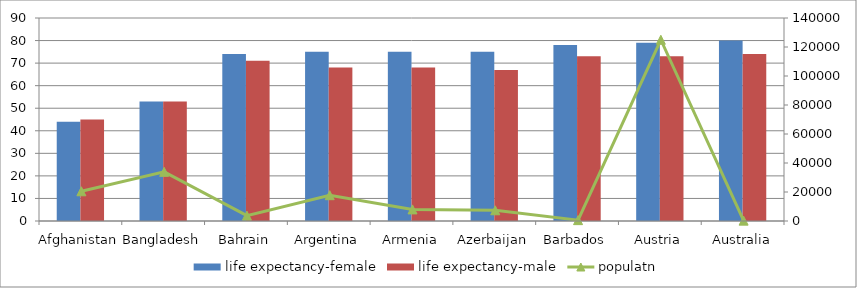
| Category | life expectancy-female | life expectancy-male |
|---|---|---|
| Afghanistan | 44 | 45 |
| Bangladesh | 53 | 53 |
| Bahrain | 74 | 71 |
| Argentina | 75 | 68 |
| Armenia | 75 | 68 |
| Azerbaijan | 75 | 67 |
| Barbados | 78 | 73 |
| Austria | 79 | 73 |
| Australia | 80 | 74 |